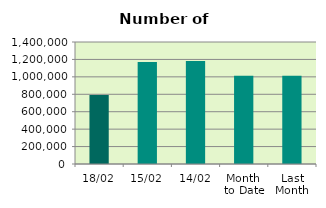
| Category | Series 0 |
|---|---|
| 18/02 | 791964 |
| 15/02 | 1170406 |
| 14/02 | 1182418 |
| Month 
to Date | 1013553 |
| Last
Month | 1012702.182 |